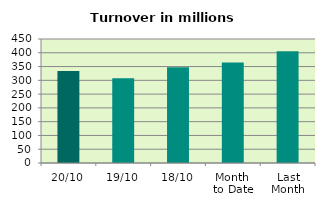
| Category | Series 0 |
|---|---|
| 20/10 | 333.429 |
| 19/10 | 307.182 |
| 18/10 | 347.387 |
| Month 
to Date | 364.639 |
| Last
Month | 405.806 |